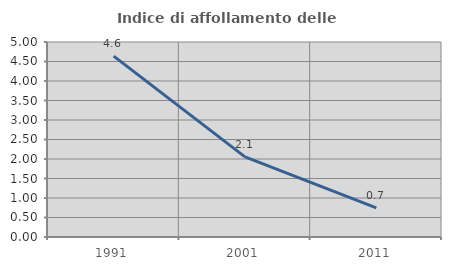
| Category | Indice di affollamento delle abitazioni  |
|---|---|
| 1991.0 | 4.638 |
| 2001.0 | 2.056 |
| 2011.0 | 0.745 |